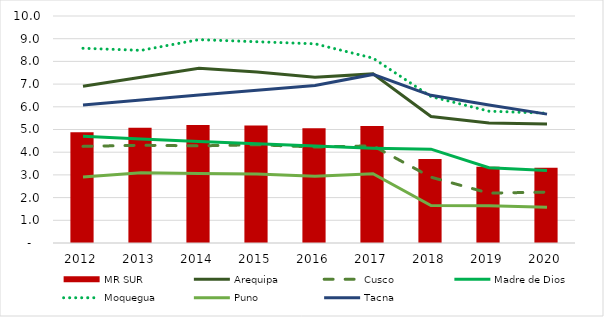
| Category | MR SUR |
|---|---|
| 0 | 4.883 |
| 1 | 5.076 |
| 2 | 5.2 |
| 3 | 5.172 |
| 4 | 5.06 |
| 5 | 5.159 |
| 6 | 3.696 |
| 7 | 3.354 |
| 8 | 3.312 |